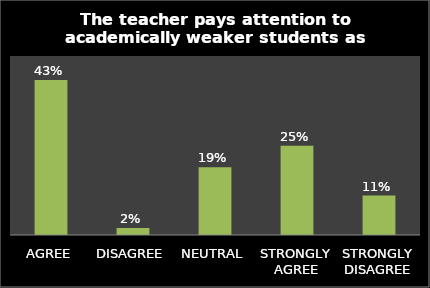
| Category | Series 0 |
|---|---|
| AGREE | 0.433 |
| DISAGREE | 0.02 |
| NEUTRAL | 0.189 |
| STRONGLY AGREE | 0.249 |
| STRONGLY DISAGREE | 0.11 |